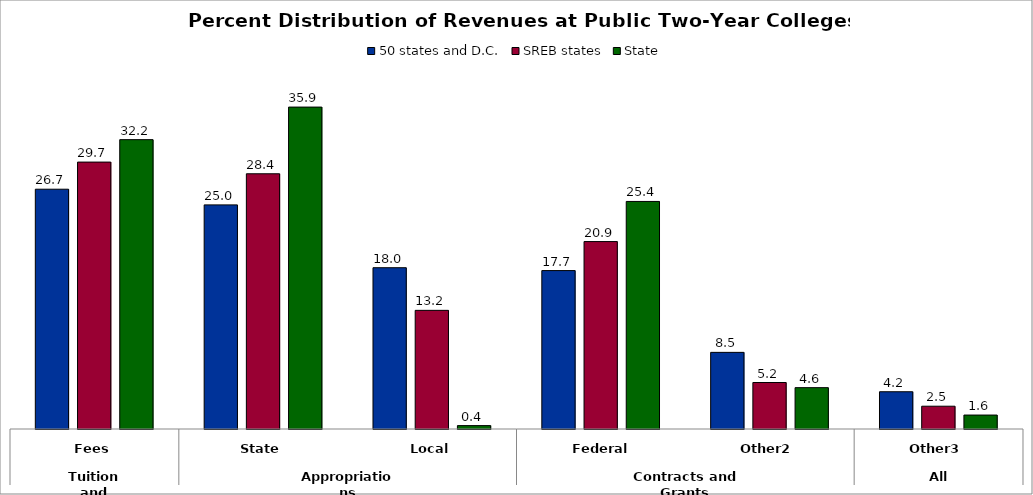
| Category | 50 states and D.C. | SREB states | State |
|---|---|---|---|
| 0 | 26.718 | 29.739 | 32.24 |
| 1 | 24.971 | 28.437 | 35.868 |
| 2 | 17.97 | 13.221 | 0.377 |
| 3 | 17.651 | 20.884 | 25.354 |
| 4 | 8.538 | 5.179 | 4.607 |
| 5 | 4.151 | 2.539 | 1.553 |